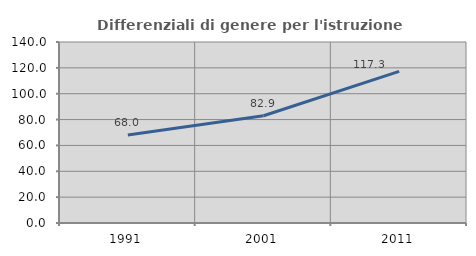
| Category | Differenziali di genere per l'istruzione superiore |
|---|---|
| 1991.0 | 68.027 |
| 2001.0 | 82.933 |
| 2011.0 | 117.308 |